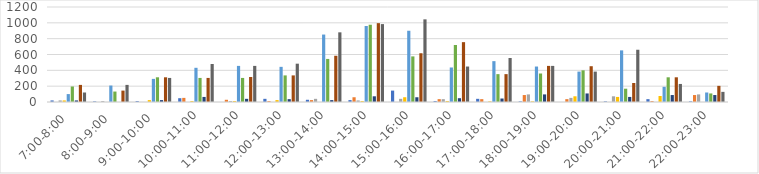
| Category | Series 0 | Series 1 | Series 2 | Series 3 | Series 4 | Series 5 | Series 6 | Series 7 | Series 8 |
|---|---|---|---|---|---|---|---|---|---|
| 7:00-8:00 | 20 | 0 | 20 | 20 | 100 | 196 | 20 | 216 | 120 |
| 8:00-9:00 | 8 | 0 | 12 | 0 | 208 | 132 | 0 | 144 | 216 |
| 9:00-10:00 | 12 | 0 | 0 | 24 | 292 | 312 | 24 | 312 | 304 |
| 10:00-11:00 | 48 | 52 | 0 | 12 | 432 | 304 | 64 | 304 | 480 |
| 11:00-12:00 | 0 | 28 | 12 | 12 | 456 | 304 | 40 | 316 | 456 |
| 12:00-13:00 | 40 | 12 | 0 | 24 | 444 | 336 | 36 | 336 | 484 |
| 13:00-14:00 | 28 | 24 | 40 | 0 | 852 | 544 | 24 | 584 | 880 |
| 14:00-15:00 | 24 | 60 | 20 | 12 | 960 | 976 | 72 | 996 | 984 |
| 15:00-16:00 | 144 | 0 | 40 | 60 | 900 | 576 | 60 | 616 | 1044 |
| 16:00-17:00 | 12 | 36 | 36 | 12 | 436 | 720 | 48 | 756 | 448 |
| 17:00-18:00 | 40 | 36 | 0 | 8 | 516 | 352 | 44 | 352 | 556 |
| 18:00-19:00 | 8 | 88 | 96 | 8 | 448 | 360 | 96 | 456 | 456 |
| 19:00-20:00 | 0 | 36 | 52 | 72 | 384 | 400 | 108 | 452 | 384 |
| 20:00-21:00 | 8 | 0 | 72 | 64 | 652 | 168 | 64 | 240 | 660 |
| 21:00-22:00 | 36 | 12 | 0 | 76 | 192 | 312 | 88 | 312 | 228 |
| 22:00-23:00 | 8 | 88 | 96 | 0 | 120 | 108 | 88 | 204 | 128 |